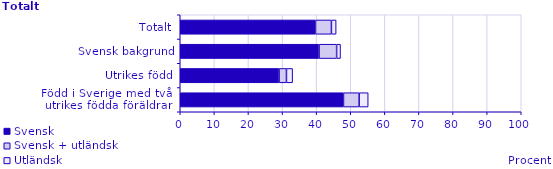
| Category | Svensk | Svensk + utländsk | Utländsk |
|---|---|---|---|
| Född i Sverige med två 
utrikes födda föräldrar | 47.864 | 4.601 | 2.65 |
| Utrikes född | 28.983 | 2.165 | 1.805 |
| Svensk bakgrund | 40.707 | 5.157 | 1.137 |
| Totalt | 39.669 | 4.665 | 1.379 |